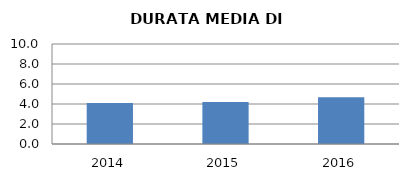
| Category | 2014 2015 2016 |
|---|---|
| 2014.0 | 4.098 |
| 2015.0 | 4.197 |
| 2016.0 | 4.679 |